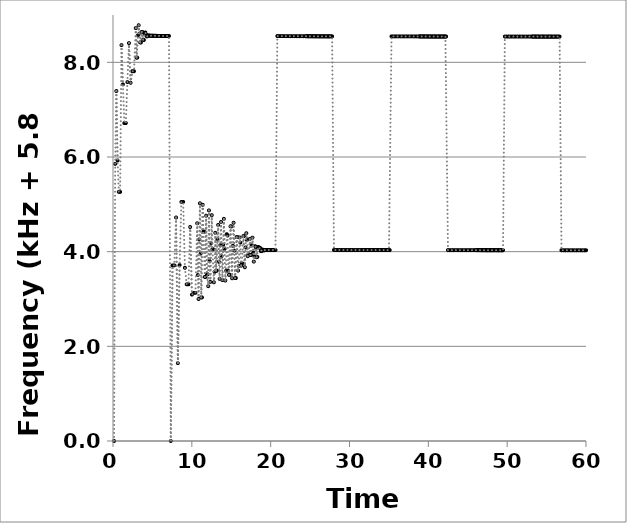
| Category | Series 2 |
|---|---|
| 0.134539 | 0 |
| 0.276529 | 5.854 |
| 0.424273 | 7.394 |
| 0.578643 | 5.927 |
| 0.738896 | 5.263 |
| 0.904017 | 5.263 |
| 1.075828 | 8.364 |
| 1.254507 | 7.534 |
| 1.439187 | 6.717 |
| 1.628751 | 6.717 |
| 1.823948 | 7.582 |
| 2.024515 | 8.406 |
| 2.232078 | 7.569 |
| 2.4447 | 7.812 |
| 2.662259 | 7.812 |
| 2.885577 | 8.723 |
| 2.980124 | 8.1 |
| 3.071944 | 8.1 |
| 3.164637 | 8.571 |
| 3.257955 | 8.783 |
| 3.35196 | 8.607 |
| 3.44734 | 8.42 |
| 3.541839 | 8.42 |
| 3.635161 | 8.642 |
| 3.728986 | 8.642 |
| 3.823983 | 8.482 |
| 3.91879 | 8.472 |
| 4.013909 | 8.598 |
| 4.109288 | 8.63 |
| 4.205153 | 8.588 |
| 4.302146 | 8.547 |
| 4.399698 | 8.556 |
| 4.497808 | 8.569 |
| 4.598497 | 8.566 |
| 4.697877 | 8.562 |
| 4.795809 | 8.562 |
| 4.893099 | 8.562 |
| 4.989783 | 8.562 |
| 5.085923 | 8.561 |
| 5.18187 | 8.561 |
| 5.278943 | 8.56 |
| 5.376024 | 8.56 |
| 5.473221 | 8.56 |
| 5.569624 | 8.56 |
| 5.663251 | 8.559 |
| 5.75802 | 8.559 |
| 5.852537 | 8.559 |
| 5.947973 | 8.558 |
| 6.040458 | 8.558 |
| 6.130513 | 8.558 |
| 6.221068 | 8.558 |
| 6.31151 | 8.558 |
| 6.400087 | 8.558 |
| 6.48812 | 8.557 |
| 6.575179 | 8.557 |
| 6.663614 | 8.557 |
| 6.750484 | 8.556 |
| 6.836801 | 8.556 |
| 6.924562 | 8.556 |
| 7.013981 | 8.556 |
| 7.102681 | 8.556 |
| 7.328307 | 0 |
| 7.553173 | 3.71 |
| 7.774734 | 3.71 |
| 7.998973 | 4.722 |
| 8.225241 | 1.645 |
| 8.450807 | 3.718 |
| 8.675008 | 5.051 |
| 8.89958 | 5.051 |
| 9.12249 | 3.66 |
| 9.34586 | 3.31 |
| 9.567485 | 3.31 |
| 9.789881 | 4.521 |
| 10.012833 | 3.092 |
| 10.23545 | 3.129 |
| 10.457282 | 3.129 |
| 10.681164 | 4.599 |
| 10.766301 | 3.506 |
| 10.851697 | 3 |
| 10.938346 | 4.257 |
| 11.025949 | 5.022 |
| 11.11208 | 3.959 |
| 11.198836 | 3.034 |
| 11.285661 | 3.034 |
| 11.373351 | 4.99 |
| 11.46319 | 4.424 |
| 11.553771 | 4.424 |
| 11.644731 | 3.466 |
| 11.733619 | 3.466 |
| 11.821543 | 4.76 |
| 11.90991 | 3.523 |
| 11.996517 | 3.523 |
| 12.082815 | 3.271 |
| 12.170589 | 4.872 |
| 12.25964 | 3.804 |
| 12.349542 | 3.361 |
| 12.437723 | 4.179 |
| 12.52648 | 4.77 |
| 12.615192 | 4.052 |
| 12.707134 | 4.052 |
| 12.798646 | 3.354 |
| 12.889451 | 3.572 |
| 12.979569 | 4.397 |
| 13.069367 | 3.598 |
| 13.159731 | 3.598 |
| 13.251097 | 4.26 |
| 13.340057 | 4.564 |
| 13.431202 | 3.786 |
| 13.521902 | 3.425 |
| 13.61176 | 4.136 |
| 13.7009 | 4.627 |
| 13.790715 | 3.907 |
| 13.882779 | 3.399 |
| 13.973031 | 4.146 |
| 14.064234 | 4.693 |
| 14.154037 | 4.058 |
| 14.244845 | 3.39 |
| 14.337417 | 3.594 |
| 14.431122 | 4.369 |
| 14.527135 | 4.341 |
| 14.621999 | 3.595 |
| 14.717307 | 3.511 |
| 14.814933 | 3.511 |
| 14.911542 | 4.535 |
| 15.008673 | 4.535 |
| 15.105235 | 3.439 |
| 15.201235 | 4.125 |
| 15.297274 | 4.61 |
| 15.392175 | 4.023 |
| 15.488116 | 3.442 |
| 15.582963 | 3.442 |
| 15.678797 | 4.307 |
| 15.774865 | 4.307 |
| 15.870553 | 3.6 |
| 15.966339 | 3.7 |
| 16.061208 | 4.301 |
| 16.157958 | 4.191 |
| 16.254034 | 3.705 |
| 16.348141 | 3.748 |
| 16.442962 | 3.748 |
| 16.537516 | 4.329 |
| 16.63032 | 4.329 |
| 16.723338 | 3.671 |
| 16.815771 | 4.088 |
| 16.905363 | 4.389 |
| 16.995291 | 4.246 |
| 17.086918 | 3.905 |
| 17.176586 | 3.94 |
| 17.265894 | 3.94 |
| 17.353011 | 4.267 |
| 17.43896 | 3.931 |
| 17.523584 | 3.931 |
| 17.607078 | 4.139 |
| 17.691155 | 4.296 |
| 17.777183 | 3.985 |
| 17.862267 | 3.79 |
| 17.949483 | 3.898 |
| 18.039764 | 4.115 |
| 18.130504 | 4.087 |
| 18.218711 | 3.883 |
| 18.309737 | 3.889 |
| 18.400311 | 4.097 |
| 18.489635 | 4.097 |
| 18.579017 | 4.078 |
| 18.667341 | 4.078 |
| 18.758243 | 4.011 |
| 18.849879 | 4.011 |
| 18.940385 | 4.044 |
| 19.03146 | 4.04 |
| 19.122153 | 4.029 |
| 19.210777 | 4.03 |
| 19.300591 | 4.035 |
| 19.390021 | 4.034 |
| 19.478819 | 4.034 |
| 19.567461 | 4.034 |
| 19.657264 | 4.035 |
| 19.747782 | 4.035 |
| 19.840489 | 4.035 |
| 19.932748 | 4.035 |
| 20.025832 | 4.035 |
| 20.12048 | 4.035 |
| 20.215339 | 4.035 |
| 20.31109 | 4.035 |
| 20.410027 | 4.035 |
| 20.508901 | 4.035 |
| 20.60915 | 4.035 |
| 20.844282 | 8.556 |
| 21.079216 | 8.554 |
| 21.314843 | 8.554 |
| 21.552482 | 8.554 |
| 21.791179 | 8.554 |
| 22.032565 | 8.553 |
| 22.27313 | 8.553 |
| 22.513191 | 8.553 |
| 22.754375 | 8.553 |
| 22.993503 | 8.553 |
| 23.231942 | 8.552 |
| 23.470969 | 8.552 |
| 23.707996 | 8.552 |
| 23.945526 | 8.552 |
| 24.183991 | 8.552 |
| 24.421452 | 8.552 |
| 24.524273 | 8.552 |
| 24.627843 | 8.551 |
| 24.730228 | 8.551 |
| 24.83055 | 8.551 |
| 24.931108 | 8.551 |
| 25.031881 | 8.551 |
| 25.133686 | 8.55 |
| 25.235636 | 8.551 |
| 25.335849 | 8.551 |
| 25.438972 | 8.55 |
| 25.541727 | 8.55 |
| 25.643841 | 8.55 |
| 25.74816 | 8.55 |
| 25.849531 | 8.55 |
| 25.949832 | 8.55 |
| 26.048751 | 8.55 |
| 26.147301 | 8.55 |
| 26.245549 | 8.549 |
| 26.343047 | 8.549 |
| 26.441929 | 8.549 |
| 26.540187 | 8.549 |
| 26.635374 | 8.549 |
| 26.729816 | 8.549 |
| 26.824487 | 8.549 |
| 26.92141 | 8.549 |
| 27.01629 | 8.548 |
| 27.111471 | 8.548 |
| 27.20673 | 8.548 |
| 27.302475 | 8.548 |
| 27.398988 | 8.548 |
| 27.49663 | 8.548 |
| 27.594888 | 8.548 |
| 27.693837 | 8.548 |
| 27.794035 | 8.548 |
| 28.029986 | 4.036 |
| 28.26531 | 4.035 |
| 28.499008 | 4.035 |
| 28.734078 | 4.035 |
| 28.968907 | 4.035 |
| 29.202623 | 4.035 |
| 29.4357 | 4.035 |
| 29.669403 | 4.035 |
| 29.903666 | 4.035 |
| 30.137413 | 4.035 |
| 30.370413 | 4.035 |
| 30.605285 | 4.035 |
| 30.839156 | 4.035 |
| 31.073032 | 4.035 |
| 31.307484 | 4.035 |
| 31.540801 | 4.035 |
| 31.639623 | 4.035 |
| 31.737377 | 4.035 |
| 31.835754 | 4.035 |
| 31.933491 | 4.035 |
| 32.030472 | 4.034 |
| 32.127363 | 4.034 |
| 32.224934 | 4.034 |
| 32.323238 | 4.034 |
| 32.421665 | 4.034 |
| 32.518301 | 4.034 |
| 32.615126 | 4.034 |
| 32.709514 | 4.034 |
| 32.805594 | 4.034 |
| 32.902491 | 4.034 |
| 33.000303 | 4.034 |
| 33.099127 | 4.034 |
| 33.196623 | 4.034 |
| 33.294622 | 4.034 |
| 33.392727 | 4.034 |
| 33.492174 | 4.034 |
| 33.590882 | 4.034 |
| 33.688054 | 4.034 |
| 33.78499 | 4.034 |
| 33.881129 | 4.034 |
| 33.977643 | 4.034 |
| 34.073774 | 4.034 |
| 34.169465 | 4.034 |
| 34.264834 | 4.034 |
| 34.360082 | 4.034 |
| 34.454892 | 4.034 |
| 34.548955 | 4.034 |
| 34.639822 | 4.034 |
| 34.730011 | 4.033 |
| 34.822071 | 4.033 |
| 34.914275 | 4.033 |
| 35.006344 | 4.033 |
| 35.099024 | 4.033 |
| 35.326916 | 8.548 |
| 35.553807 | 8.548 |
| 35.780944 | 8.548 |
| 36.00733 | 8.548 |
| 36.235096 | 8.548 |
| 36.46286 | 8.548 |
| 36.693449 | 8.548 |
| 36.924085 | 8.548 |
| 37.154981 | 8.548 |
| 37.385749 | 8.548 |
| 37.617689 | 8.548 |
| 37.850694 | 8.548 |
| 38.082903 | 8.547 |
| 38.316353 | 8.547 |
| 38.549927 | 8.547 |
| 38.784012 | 8.547 |
| 38.884638 | 8.547 |
| 38.98482 | 8.547 |
| 39.084814 | 8.547 |
| 39.186121 | 8.546 |
| 39.28954 | 8.547 |
| 39.391399 | 8.547 |
| 39.492708 | 8.546 |
| 39.594452 | 8.546 |
| 39.695185 | 8.546 |
| 39.796491 | 8.546 |
| 39.898002 | 8.546 |
| 39.999191 | 8.546 |
| 40.099799 | 8.546 |
| 40.201042 | 8.546 |
| 40.301539 | 8.546 |
| 40.402537 | 8.546 |
| 40.503407 | 8.546 |
| 40.605098 | 8.546 |
| 40.706786 | 8.546 |
| 40.806731 | 8.546 |
| 40.905815 | 8.546 |
| 41.005967 | 8.546 |
| 41.105145 | 8.545 |
| 41.201781 | 8.545 |
| 41.299289 | 8.545 |
| 41.395479 | 8.545 |
| 41.491792 | 8.545 |
| 41.589172 | 8.545 |
| 41.685618 | 8.545 |
| 41.780563 | 8.545 |
| 41.876314 | 8.545 |
| 41.972139 | 8.545 |
| 42.068532 | 8.545 |
| 42.163328 | 8.545 |
| 42.259271 | 8.545 |
| 42.491725 | 4.033 |
| 42.723294 | 4.032 |
| 42.956732 | 4.032 |
| 43.189273 | 4.032 |
| 43.423845 | 4.032 |
| 43.658797 | 4.032 |
| 43.895257 | 4.032 |
| 44.131344 | 4.032 |
| 44.367054 | 4.032 |
| 44.603263 | 4.032 |
| 44.839549 | 4.032 |
| 45.072867 | 4.032 |
| 45.302923 | 4.032 |
| 45.532176 | 4.032 |
| 45.763203 | 4.032 |
| 45.992964 | 4.032 |
| 46.086526 | 4.032 |
| 46.178396 | 4.032 |
| 46.267283 | 4.032 |
| 46.35652 | 4.032 |
| 46.445512 | 4.032 |
| 46.534151 | 4.031 |
| 46.621587 | 4.031 |
| 46.710319 | 4.031 |
| 46.795736 | 4.031 |
| 46.880613 | 4.031 |
| 46.965482 | 4.031 |
| 47.052113 | 4.031 |
| 47.141638 | 4.031 |
| 47.231266 | 4.031 |
| 47.320722 | 4.031 |
| 47.411529 | 4.031 |
| 47.504348 | 4.031 |
| 47.599493 | 4.031 |
| 47.694926 | 4.031 |
| 47.791859 | 4.031 |
| 47.887314 | 4.031 |
| 47.979983 | 4.031 |
| 48.07154 | 4.03 |
| 48.162875 | 4.031 |
| 48.257332 | 4.03 |
| 48.351956 | 4.031 |
| 48.446511 | 4.031 |
| 48.542965 | 4.03 |
| 48.638018 | 4.03 |
| 48.731465 | 4.03 |
| 48.82519 | 4.03 |
| 48.917139 | 4.03 |
| 49.007452 | 4.03 |
| 49.098831 | 4.03 |
| 49.191706 | 4.03 |
| 49.285212 | 4.03 |
| 49.379959 | 4.03 |
| 49.474648 | 4.03 |
| 49.706229 | 8.545 |
| 49.9378 | 8.545 |
| 50.167047 | 8.545 |
| 50.393742 | 8.545 |
| 50.621189 | 8.545 |
| 50.848749 | 8.545 |
| 51.076824 | 8.545 |
| 51.308191 | 8.545 |
| 51.538351 | 8.545 |
| 51.769737 | 8.545 |
| 52.001371 | 8.545 |
| 52.230567 | 8.545 |
| 52.459657 | 8.545 |
| 52.687604 | 8.545 |
| 52.913817 | 8.545 |
| 53.140761 | 8.544 |
| 53.233394 | 8.544 |
| 53.326085 | 8.544 |
| 53.421227 | 8.544 |
| 53.520976 | 8.544 |
| 53.620478 | 8.544 |
| 53.718611 | 8.544 |
| 53.818984 | 8.544 |
| 53.917682 | 8.544 |
| 54.016415 | 8.544 |
| 54.114102 | 8.544 |
| 54.212472 | 8.544 |
| 54.312406 | 8.544 |
| 54.412455 | 8.544 |
| 54.512397 | 8.544 |
| 54.61264 | 8.544 |
| 54.714289 | 8.544 |
| 54.815032 | 8.544 |
| 54.913406 | 8.544 |
| 55.011716 | 8.544 |
| 55.108279 | 8.544 |
| 55.203724 | 8.544 |
| 55.299173 | 8.544 |
| 55.391681 | 8.544 |
| 55.484999 | 8.544 |
| 55.579519 | 8.544 |
| 55.675648 | 8.544 |
| 55.770847 | 8.544 |
| 55.863895 | 8.544 |
| 55.956913 | 8.544 |
| 56.051218 | 8.544 |
| 56.148336 | 8.544 |
| 56.247705 | 8.544 |
| 56.347279 | 8.544 |
| 56.449271 | 8.544 |
| 56.549841 | 8.544 |
| 56.652097 | 8.543 |
| 56.889173 | 4.03 |
| 57.126938 | 4.03 |
| 57.36707 | 4.03 |
| 57.608022 | 4.03 |
| 57.84922 | 4.03 |
| 58.091238 | 4.029 |
| 58.334002 | 4.029 |
| 58.578284 | 4.029 |
| 58.822535 | 4.029 |
| 59.063878 | 4.029 |
| 59.302594 | 4.029 |
| 59.538229 | 4.029 |
| 59.773985 | 4.029 |
| 60.009306 | 4.029 |
| 60.243395 | 4.029 |
| 60.476592 | 4.029 |
| 60.575019 | 4.029 |
| 60.672895 | 4.029 |
| 60.769234 | 4.029 |
| 60.863175 | 4.029 |
| 60.957117 | 4.029 |
| 61.049243 | 4.029 |
| 61.141002 | 4.029 |
| 61.232324 | 4.029 |
| 61.323072 | 4.029 |
| 61.414743 | 4.029 |
| 61.507249 | 4.029 |
| 61.601885 | 4.029 |
| 61.696575 | 4.029 |
| 61.788224 | 4.029 |
| 61.880459 | 4.029 |
| 61.973404 | 4.029 |
| 62.06854 | 4.029 |
| 62.163597 | 4.029 |
| 62.260205 | 4.029 |
| 62.357752 | 4.029 |
| 62.454757 | 4.029 |
| 62.55169 | 4.029 |
| 62.649238 | 4.029 |
| 62.746601 | 4.028 |
| 62.845734 | 4.029 |
| 62.944553 | 4.029 |
| 63.042796 | 4.029 |
| 63.141288 | 4.029 |
| 63.238285 | 4.029 |
| 63.338654 | 4.028 |
| 63.440593 | 4.028 |
| 63.541481 | 4.029 |
| 63.64093 | 4.029 |
| 63.740625 | 4.029 |
| 63.839939 | 4.029 |
| 63.938577 | 4.029 |
| 64.170332 | 8.543 |
| 64.40353 | 8.544 |
| 64.637223 | 8.544 |
| 64.870617 | 8.544 |
| 65.10393 | 8.544 |
| 65.338071 | 8.544 |
| 65.572465 | 8.544 |
| 65.805721 | 8.544 |
| 66.040919 | 8.544 |
| 66.274865 | 8.544 |
| 66.509199 | 8.544 |
| 66.742819 | 8.544 |
| 66.976274 | 8.544 |
| 67.208205 | 8.544 |
| 67.438655 | 8.544 |
| 67.670543 | 8.544 |
| 67.768287 | 8.544 |
| 67.86317 | 8.544 |
| 67.95524 | 8.544 |
| 68.047788 | 8.544 |
| 68.139934 | 8.544 |
| 68.232633 | 8.544 |
| 68.326821 | 8.544 |
| 68.421277 | 8.544 |
| 68.513912 | 8.544 |
| 68.608235 | 8.544 |
| 68.70267 | 8.544 |
| 68.797179 | 8.544 |
| 68.89192 | 8.544 |
| 68.988182 | 8.543 |
| 69.084495 | 8.543 |
| 69.180496 | 8.543 |
| 69.275683 | 8.543 |
| 69.373807 | 8.543 |
| 69.473692 | 8.543 |
| 69.573083 | 8.543 |
| 69.672197 | 8.543 |
| 69.769944 | 8.543 |
| 69.865198 | 8.543 |
| 69.961702 | 8.543 |
| 70.057769 | 8.543 |
| 70.151633 | 8.543 |
| 70.244565 | 8.543 |
| 70.33837 | 8.543 |
| 70.430491 | 8.543 |
| 70.522425 | 8.543 |
| 70.616811 | 8.543 |
| 70.71033 | 8.543 |
| 70.804456 | 8.543 |
| 70.899031 | 8.543 |
| 70.993035 | 8.543 |
| 71.087543 | 8.543 |
| 71.179985 | 8.543 |
| 71.408603 | 4.029 |
| 71.639344 | 4.028 |
| 71.868716 | 4.028 |
| 72.098903 | 4.028 |
| 72.330365 | 4.028 |
| 72.56224 | 4.028 |
| 72.795076 | 4.029 |
| 73.028591 | 4.029 |
| 73.262357 | 4.029 |
| 73.493316 | 4.029 |
| 73.72531 | 4.029 |
| 73.959275 | 4.029 |
| 74.192974 | 4.029 |
| 74.427803 | 4.029 |
| 74.663749 | 4.029 |
| 74.901319 | 4.029 |
| 75.002705 | 4.029 |
| 75.10353 | 4.029 |
| 75.204738 | 4.029 |
| 75.307631 | 4.029 |
| 75.410755 | 4.029 |
| 75.513033 | 4.029 |
| 75.613908 | 4.029 |
| 75.716354 | 4.029 |
| 75.818673 | 4.029 |
| 75.923049 | 4.029 |
| 76.025353 | 4.029 |
| 76.125457 | 4.029 |
| 76.223707 | 4.029 |
| 76.320507 | 4.029 |
| 76.41706 | 4.029 |
| 76.512123 | 4.029 |
| 76.607196 | 4.029 |
| 76.702322 | 4.029 |
| 76.795878 | 4.029 |
| 76.886264 | 4.029 |
| 76.976213 | 4.029 |
| 77.068641 | 4.029 |
| 77.160705 | 4.029 |
| 77.252022 | 4.029 |
| 77.343649 | 4.029 |
| 77.432755 | 4.029 |
| 77.523715 | 4.029 |
| 77.61642 | 4.029 |
| 77.710664 | 4.029 |
| 77.806925 | 4.029 |
| 77.903498 | 4.029 |
| 78.001756 | 4.029 |
| 78.102129 | 4.029 |
| 78.20219 | 4.029 |
| 78.304383 | 4.029 |
| 78.545004 | 8.543 |
| 78.784573 | 8.543 |
| 79.023822 | 8.544 |
| 79.263457 | 8.543 |
| 79.50321 | 8.543 |
| 79.742596 | 8.543 |
| 79.984474 | 8.544 |
| 80.226353 | 8.544 |
| 80.467856 | 8.544 |
| 80.708364 | 8.544 |
| 80.947485 | 8.544 |
| 81.185315 | 8.544 |
| 81.424129 | 8.544 |
| 81.662901 | 8.544 |
| 81.901419 | 8.544 |
| 82.139924 | 8.543 |
| 82.241159 | 8.544 |
| 82.342768 | 8.544 |
| 82.44465 | 8.543 |
| 82.545828 | 8.543 |
| 82.647568 | 8.544 |
| 82.749818 | 8.544 |
| 82.852329 | 8.544 |
| 82.954519 | 8.544 |
| 83.055156 | 8.544 |
| 83.154972 | 8.544 |
| 83.255481 | 8.544 |
| 83.357981 | 8.544 |
| 83.460684 | 8.544 |
| 83.561736 | 8.544 |
| 83.663737 | 8.544 |
| 83.765481 | 8.544 |
| 83.868687 | 8.544 |
| 83.971711 | 8.544 |
| 84.073539 | 8.544 |
| 84.175754 | 8.544 |
| 84.277774 | 8.544 |
| 84.375894 | 8.544 |
| 84.471391 | 8.544 |
| 84.566278 | 8.544 |
| 84.662716 | 8.543 |
| 84.760851 | 8.544 |
| 84.858299 | 8.544 |
| 84.954806 | 8.543 |
| 85.049749 | 8.543 |
| 85.145507 | 8.543 |
| 85.242085 | 8.543 |
| 85.338979 | 8.543 |
| 85.434344 | 8.543 |
| 85.530162 | 8.543 |
| 85.625838 | 8.543 |
| 85.856912 | 4.029 |
| 86.088176 | 4.029 |
| 86.322263 | 4.029 |
| 86.55879 | 4.029 |
| 86.795982 | 4.029 |
| 87.033749 | 4.029 |
| 87.269748 | 4.029 |
| 87.506365 | 4.029 |
| 87.742047 | 4.029 |
| 87.976173 | 4.029 |
| 88.207856 | 4.029 |
| 88.437093 | 4.029 |
| 88.664401 | 4.029 |
| 88.892349 | 4.029 |
| 89.121344 | 4.029 |
| 89.35048 | 4.029 |
| 89.444223 | 4.029 |
| 89.53684 | 4.029 |
| 89.629644 | 4.029 |
| 89.721323 | 4.029 |
| 89.814379 | 4.029 |
| 89.906116 | 4.029 |
| 89.99833 | 4.029 |
| 90.089231 | 4.029 |
| 90.181381 | 4.029 |
| 90.275448 | 4.029 |
| 90.370339 | 4.029 |
| 90.467801 | 4.029 |
| 90.566882 | 4.029 |
| 90.666963 | 4.029 |
| 90.766096 | 4.029 |
| 90.863851 | 4.029 |
| 90.962176 | 4.029 |
| 91.060691 | 4.029 |
| 91.159063 | 4.029 |
| 91.258126 | 4.029 |
| 91.356208 | 4.029 |
| 91.454786 | 4.029 |
| 91.554783 | 4.029 |
| 91.65684 | 4.029 |
| 91.758834 | 4.029 |
| 91.860588 | 4.029 |
| 91.962898 | 4.029 |
| 92.062071 | 4.029 |
| 92.161008 | 4.029 |
| 92.258889 | 4.029 |
| 92.356831 | 4.029 |
| 92.455667 | 4.029 |
| 92.552531 | 4.029 |
| 92.651721 | 4.029 |
| 92.749843 | 4.029 |
| 92.846593 | 4.029 |
| 93.078095 | 8.543 |
| 93.310669 | 8.544 |
| 93.542051 | 8.544 |
| 93.770876 | 8.544 |
| 93.99839 | 8.544 |
| 94.224262 | 8.544 |
| 94.449198 | 8.544 |
| 94.675781 | 8.544 |
| 94.901786 | 8.544 |
| 95.127023 | 8.544 |
| 95.353666 | 8.544 |
| 95.580662 | 8.544 |
| 95.810174 | 8.544 |
| 96.038171 | 8.544 |
| 96.268328 | 8.544 |
| 96.499473 | 8.544 |
| 96.596098 | 8.544 |
| 96.69166 | 8.544 |
| 96.78816 | 8.544 |
| 96.884777 | 8.544 |
| 96.98116 | 8.544 |
| 97.077745 | 8.544 |
| 97.175956 | 8.544 |
| 97.275205 | 8.544 |
| 97.375273 | 8.544 |
| 97.476038 | 8.544 |
| 97.574148 | 8.544 |
| 97.673724 | 8.544 |
| 97.771227 | 8.544 |
| 97.868557 | 8.544 |
| 97.965417 | 8.544 |
| 98.063157 | 8.544 |
| 98.16066 | 8.544 |
| 98.257735 | 8.544 |
| 98.35449 | 8.544 |
| 98.451445 | 8.544 |
| 98.548688 | 8.544 |
| 98.648061 | 8.544 |
| 98.746369 | 8.544 |
| 98.84319 | 8.544 |
| 98.940183 | 8.544 |
| 99.037 | 8.544 |
| 99.133833 | 8.544 |
| 99.228763 | 8.544 |
| 99.324516 | 8.544 |
| 99.419512 | 8.544 |
| 99.512734 | 8.544 |
| 99.606077 | 8.544 |
| 99.697644 | 8.544 |
| 99.788331 | 8.544 |
| 99.878899 | 8.544 |
| 99.968655 | 8.544 |
| 100.05953 | 8.544 |
| 100.284359 | 4.029 |
| 100.508785 | 4.029 |
| 100.732203 | 4.029 |
| 100.956298 | 4.029 |
| 101.180995 | 4.029 |
| 101.407308 | 4.029 |
| 101.633498 | 4.029 |
| 101.861886 | 4.029 |
| 102.090209 | 4.029 |
| 102.321437 | 4.029 |
| 102.551056 | 4.029 |
| 102.783245 | 4.029 |
| 103.016797 | 4.029 |
| 103.250304 | 4.029 |
| 103.486433 | 4.029 |
| 103.721006 | 4.029 |
| 103.821441 | 4.029 |
| 103.923846 | 4.029 |
| 104.028236 | 4.029 |
| 104.130404 | 4.029 |
| 104.232902 | 4.029 |
| 104.336286 | 4.029 |
| 104.440238 | 4.029 |
| 104.543296 | 4.029 |
| 104.647551 | 4.029 |
| 104.748991 | 4.029 |
| 104.850823 | 4.029 |
| 104.951959 | 4.029 |
| 105.051608 | 4.029 |
| 105.151423 | 4.029 |
| 105.251471 | 4.029 |
| 105.353351 | 4.029 |
| 105.454108 | 4.029 |
| 105.553302 | 4.029 |
| 105.651436 | 4.029 |
| 105.750688 | 4.029 |
| 105.846944 | 4.029 |
| 105.942371 | 4.029 |
| 106.037241 | 4.029 |
| 106.128555 | 4.029 |
| 106.219865 | 4.029 |
| 106.312821 | 4.029 |
| 106.406249 | 4.029 |
| 106.497827 | 4.029 |
| 106.5917 | 4.029 |
| 106.685264 | 4.029 |
| 106.777342 | 4.029 |
| 106.868925 | 4.029 |
| 106.962547 | 4.029 |
| 107.056163 | 4.029 |
| 107.150603 | 4.029 |
| 107.245424 | 4.029 |
| 107.477557 | 8.544 |
| 107.709629 | 8.544 |
| 107.940825 | 8.544 |
| 108.174268 | 8.544 |
| 108.404925 | 8.544 |
| 108.635873 | 8.544 |
| 108.86632 | 8.544 |
| 109.097816 | 8.544 |
| 109.328074 | 8.544 |
| 109.557766 | 8.544 |
| 109.787849 | 8.544 |
| 110.017657 | 8.544 |
| 110.246218 | 8.544 |
| 110.473027 | 8.544 |
| 110.698489 | 8.544 |
| 110.923188 | 8.545 |
| 111.011819 | 8.545 |
| 111.10001 | 8.545 |
| 111.188572 | 8.544 |
| 111.277196 | 8.544 |
| 111.368488 | 8.544 |
| 111.457605 | 8.544 |
| 111.547294 | 8.544 |
| 111.638538 | 8.544 |
| 111.729473 | 8.544 |
| 111.820537 | 8.544 |
| 111.910781 | 8.544 |
| 112.001021 | 8.544 |
| 112.091352 | 8.544 |
| 112.183749 | 8.544 |
| 112.277246 | 8.544 |
| 112.371433 | 8.544 |
| 112.467698 | 8.544 |
| 112.564151 | 8.544 |
| 112.660292 | 8.544 |
| 112.757001 | 8.544 |
| 112.853633 | 8.544 |
| 112.952213 | 8.544 |
| 113.049919 | 8.544 |
| 113.146616 | 8.544 |
| 113.243935 | 8.544 |
| 113.34119 | 8.544 |
| 113.439259 | 8.544 |
| 113.538141 | 8.544 |
| 113.634688 | 8.544 |
| 113.73188 | 8.544 |
| 113.829389 | 8.544 |
| 113.926899 | 8.544 |
| 114.024452 | 8.544 |
| 114.123951 | 8.544 |
| 114.225509 | 8.544 |
| 114.326317 | 8.544 |
| 114.427254 | 8.544 |
| 114.662686 | 4.029 |
| 114.898482 | 4.029 |
| 115.134111 | 4.029 |
| 115.370064 | 4.029 |
| 115.606957 | 4.029 |
| 115.843772 | 4.029 |
| 116.080102 | 4.029 |
| 116.317617 | 4.029 |
| 116.554551 | 4.029 |
| 116.791801 | 4.029 |
| 117.02556 | 4.029 |
| 117.259947 | 4.029 |
| 117.49208 | 4.029 |
| 117.724091 | 4.029 |
| 117.957788 | 4.029 |
| 118.19111 | 4.029 |
| 118.290561 | 4.029 |
| 118.390644 | 4.03 |
| 118.491467 | 4.03 |
| 118.593653 | 4.03 |
| 118.695969 | 4.03 |
| 118.798301 | 4.03 |
| 118.900493 | 4.029 |
| 119.004507 | 4.029 |
| 119.108143 | 4.03 |
| 119.212149 | 4.03 |
| 119.319216 | 4.03 |
| 119.425913 | 4.03 |
| 119.533727 | 4.029 |
| 119.638993 | 4.029 |
| 119.74294 | 4.029 |
| 119.845194 | 4.029 |
| 119.945137 | 4.03 |
| 120.044887 | 4.029 |
| 120.14321 | 4.029 |
| 120.238149 | 4.03 |
| 120.333028 | 4.03 |
| 120.429274 | 4.03 |
| 120.525831 | 4.03 |
| 120.621903 | 4.03 |
| 120.719727 | 4.03 |
| 120.817613 | 4.03 |
| 120.915417 | 4.03 |
| 121.012866 | 4.03 |
| 121.109629 | 4.03 |
| 121.208506 | 4.03 |
| 121.307203 | 4.03 |
| 121.405029 | 4.03 |
| 121.505663 | 4.03 |
| 121.606793 | 4.03 |
| 121.841309 | 8.544 |
| 122.077574 | 8.545 |
| 122.31214 | 8.545 |
| 122.54484 | 8.545 |
| 122.776236 | 8.545 |
| 123.006491 | 8.545 |
| 123.236057 | 8.545 |
| 123.464802 | 8.545 |
| 123.69095 | 8.545 |
| 123.917008 | 8.545 |
| 124.144011 | 8.545 |
| 124.371703 | 8.545 |
| 124.598707 | 8.545 |
| 124.828755 | 8.546 |
| 125.055805 | 8.546 |
| 125.28274 | 8.545 |
| 125.376791 | 8.545 |
| 125.470725 | 8.546 |
| 125.566412 | 8.546 |
| 125.662961 | 8.546 |
| 125.760767 | 8.546 |
| 125.857824 | 8.546 |
| 125.95545 | 8.546 |
| 126.05283 | 8.546 |
| 126.153021 | 8.546 |
| 126.252152 | 8.546 |
| 126.350773 | 8.546 |
| 126.448456 | 8.546 |
| 126.54665 | 8.546 |
| 126.644728 | 8.546 |
| 126.743871 | 8.546 |
| 126.841809 | 8.546 |
| 126.938569 | 8.546 |
| 127.036218 | 8.546 |
| 127.134479 | 8.546 |
| 127.231814 | 8.546 |
| 127.327181 | 8.546 |
| 127.42382 | 8.546 |
| 127.519883 | 8.546 |
| 127.616696 | 8.546 |
| 127.713576 | 8.546 |
| 127.809585 | 8.546 |
| 127.906031 | 8.545 |
| 128.003603 | 8.546 |
| 128.102162 | 8.546 |
| 128.200294 | 8.546 |
| 128.299041 | 8.546 |
| 128.397736 | 8.546 |
| 128.498171 | 8.546 |
| 128.595337 | 8.546 |
| 128.691896 | 8.546 |
| 128.788452 | 8.546 |
| 129.020153 | 4.03 |
| 129.252594 | 4.03 |
| 129.486601 | 4.03 |
| 129.721239 | 4.03 |
| 129.955927 | 4.03 |
| 130.190432 | 4.03 |
| 130.424754 | 4.03 |
| 130.657946 | 4.03 |
| 130.890081 | 4.03 |
| 131.123271 | 4.03 |
| 131.356711 | 4.03 |
| 131.590041 | 4.03 |
| 131.823869 | 4.03 |
| 132.059196 | 4.03 |
| 132.294328 | 4.03 |
| 132.531388 | 4.03 |
| 132.635591 | 4.03 |
| 132.738681 | 4.03 |
| 132.839329 | 4.03 |
| 132.937782 | 4.03 |
| 133.03448 | 4.03 |
| 133.133555 | 4.03 |
| 133.232375 | 4.03 |
| 133.331639 | 4.03 |
| 133.432249 | 4.03 |
| 133.532487 | 4.03 |
| 133.633176 | 4.03 |
| 133.73329 | 4.03 |
| 133.832414 | 4.03 |
| 133.931789 | 4.03 |
| 134.032053 | 4.03 |
| 134.131379 | 4.03 |
| 134.230873 | 4.031 |
| 134.332347 | 4.031 |
| 134.436255 | 4.03 |
| 134.542513 | 4.031 |
| 134.648315 | 4.031 |
| 134.752564 | 4.031 |
| 134.857632 | 4.031 |
| 134.963894 | 4.031 |
| 135.069661 | 4.031 |
| 135.172742 | 4.031 |
| 135.275263 | 4.031 |
| 135.379845 | 4.03 |
| 135.483473 | 4.031 |
| 135.586231 | 4.031 |
| 135.688036 | 4.031 |
| 135.787659 | 4.031 |
| 135.884793 | 4.031 |
| 135.977416 | 4.031 |
| 136.067747 | 4.031 |
| 136.293062 | 8.546 |
| 136.520835 | 8.546 |
| 136.75084 | 8.546 |
| 136.978849 | 8.546 |
| 137.20558 | 8.546 |
| 137.431456 | 8.546 |
| 137.65897 | 8.546 |
| 137.88541 | 8.546 |
| 138.11123 | 8.546 |
| 138.337571 | 8.546 |
| 138.565084 | 8.546 |
| 138.792418 | 8.547 |
| 139.021438 | 8.547 |
| 139.252392 | 8.547 |
| 139.486664 | 8.547 |
| 139.721227 | 8.547 |
| 139.82002 | 8.547 |
| 139.918459 | 8.547 |
| 140.014039 | 8.547 |
| 140.109781 | 8.547 |
| 140.206738 | 8.547 |
| 140.303496 | 8.547 |
| 140.400435 | 8.547 |
| 140.497395 | 8.547 |
| 140.593292 | 8.547 |
| 140.689792 | 8.547 |
| 140.787715 | 8.547 |
| 140.885039 | 8.547 |
| 140.983727 | 8.547 |
| 141.08235 | 8.547 |
| 141.180672 | 8.547 |
| 141.278193 | 8.547 |
| 141.37603 | 8.547 |
| 141.472666 | 8.547 |
| 141.569841 | 8.547 |
| 141.667164 | 8.547 |
| 141.763468 | 8.547 |
| 141.859787 | 8.547 |
| 141.956787 | 8.547 |
| 142.056146 | 8.547 |
| 142.156877 | 8.547 |
| 142.256241 | 8.547 |
| 142.355258 | 8.547 |
| 142.455122 | 8.547 |
| 142.554497 | 8.547 |
| 142.653759 | 8.547 |
| 142.752269 | 8.547 |
| 142.851463 | 8.547 |
| 142.949659 | 8.547 |
| 143.048851 | 8.547 |
| 143.149233 | 8.547 |
| 143.387062 | 4.031 |
| 143.624272 | 4.031 |
| 143.863107 | 4.031 |
| 144.100752 | 4.031 |
| 144.336894 | 4.031 |
| 144.572098 | 4.031 |
| 144.807427 | 4.031 |
| 145.042448 | 4.031 |
| 145.277971 | 4.031 |
| 145.512426 | 4.031 |
| 145.748991 | 4.031 |
| 145.986051 | 4.031 |
| 146.223098 | 4.031 |
| 146.461154 | 4.031 |
| 146.698521 | 4.031 |
| 146.934906 | 4.031 |
| 147.034454 | 4.031 |
| 147.132752 | 4.031 |
| 147.227425 | 4.031 |
| 147.322725 | 4.031 |
| 147.414963 | 4.031 |
| 147.508077 | 4.031 |
| 147.601138 | 4.031 |
| 147.694689 | 4.031 |
| 147.787679 | 4.031 |
| 147.880128 | 4.031 |
| 147.970696 | 4.031 |
| 148.060327 | 4.031 |
| 148.150706 | 4.031 |
| 148.23991 | 4.031 |
| 148.329905 | 4.031 |
| 148.42133 | 4.031 |
| 148.510473 | 4.031 |
| 148.600287 | 4.032 |
| 148.691672 | 4.032 |
| 148.782798 | 4.031 |
| 148.87649 | 4.032 |
| 148.967687 | 4.032 |
| 149.05994 | 4.032 |
| 149.150999 | 4.032 |
| 149.240308 | 4.032 |
| 149.330174 | 4.032 |
| 149.418292 | 4.032 |
| 149.506913 | 4.032 |
| 149.594738 | 4.032 |
| 149.681921 | 4.032 |
| 149.766877 | 4.032 |
| 149.851275 | 4.032 |
| 149.938465 | 4.032 |
| 150.026178 | 4.032 |
| 150.116877 | 4.032 |
| 150.206884 | 4.032 |
| 150.297338 | 4.032 |
| 150.389782 | 4.032 |